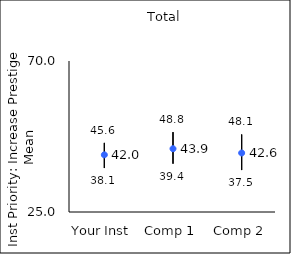
| Category | 25th percentile | 75th percentile | Mean |
|---|---|---|---|
| Your Inst | 38.1 | 45.6 | 42.04 |
| Comp 1 | 39.4 | 48.8 | 43.86 |
| Comp 2 | 37.5 | 48.1 | 42.59 |